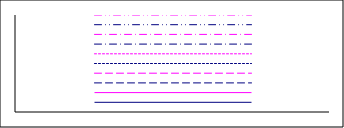
| Category | Series 1 | Series 2 | Series 3 | Series 4 | Series 5 | Series 6 | Series 7 | Series 8 | Series 9 | Series 10 |
|---|---|---|---|---|---|---|---|---|---|---|
| Point 1 | 1 | 2 | 3 | 4 | 5 | 6 | 7 | 8 | 9 | 10 |
| Point 2 | 1 | 2 | 3 | 4 | 5 | 6 | 7 | 8 | 9 | 10 |